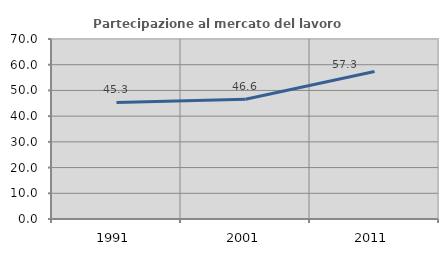
| Category | Partecipazione al mercato del lavoro  femminile |
|---|---|
| 1991.0 | 45.318 |
| 2001.0 | 46.57 |
| 2011.0 | 57.343 |